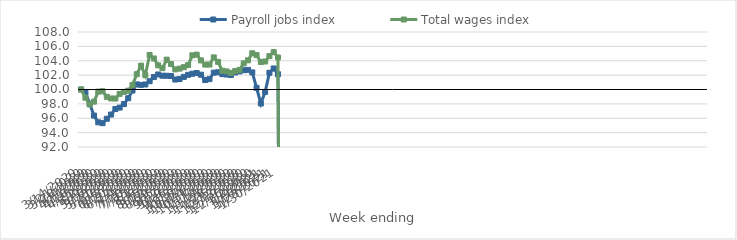
| Category | Payroll jobs index | Total wages index |
|---|---|---|
| 14/03/2020 | 100 | 100 |
| 21/03/2020 | 99.572 | 98.86 |
| 28/03/2020 | 98.031 | 97.922 |
| 04/04/2020 | 96.37 | 98.312 |
| 11/04/2020 | 95.432 | 99.706 |
| 18/04/2020 | 95.313 | 99.762 |
| 25/04/2020 | 95.928 | 98.98 |
| 02/05/2020 | 96.517 | 98.753 |
| 09/05/2020 | 97.288 | 98.74 |
| 16/05/2020 | 97.481 | 99.389 |
| 23/05/2020 | 97.965 | 99.672 |
| 30/05/2020 | 98.78 | 99.836 |
| 06/06/2020 | 99.854 | 100.624 |
| 13/06/2020 | 100.71 | 102.131 |
| 20/06/2020 | 100.645 | 103.317 |
| 27/06/2020 | 100.7 | 101.986 |
| 04/07/2020 | 101.148 | 104.799 |
| 11/07/2020 | 101.744 | 104.32 |
| 18/07/2020 | 102.092 | 103.357 |
| 25/07/2020 | 101.919 | 102.968 |
| 01/08/2020 | 101.912 | 104.154 |
| 08/08/2020 | 101.876 | 103.547 |
| 15/08/2020 | 101.386 | 102.796 |
| 22/08/2020 | 101.463 | 102.903 |
| 29/08/2020 | 101.753 | 103.105 |
| 05/09/2020 | 102.041 | 103.394 |
| 12/09/2020 | 102.194 | 104.756 |
| 19/09/2020 | 102.29 | 104.854 |
| 26/09/2020 | 102.062 | 104.049 |
| 03/10/2020 | 101.315 | 103.465 |
| 10/10/2020 | 101.443 | 103.468 |
| 17/10/2020 | 102.343 | 104.468 |
| 24/10/2020 | 102.398 | 103.838 |
| 31/10/2020 | 102.133 | 102.605 |
| 07/11/2020 | 102.085 | 102.518 |
| 14/11/2020 | 102.012 | 102.314 |
| 21/11/2020 | 102.376 | 102.566 |
| 28/11/2020 | 102.518 | 102.729 |
| 05/12/2020 | 102.681 | 103.637 |
| 12/12/2020 | 102.727 | 104.059 |
| 19/12/2020 | 102.38 | 105.043 |
| 26/12/2020 | 100.225 | 104.788 |
| 02/01/2021 | 98.052 | 103.829 |
| 09/01/2021 | 99.664 | 103.892 |
| 16/01/2021 | 102.326 | 104.645 |
| 23/01/2021 | 102.928 | 105.211 |
| 30/01/2021 | 102.126 | 104.458 |